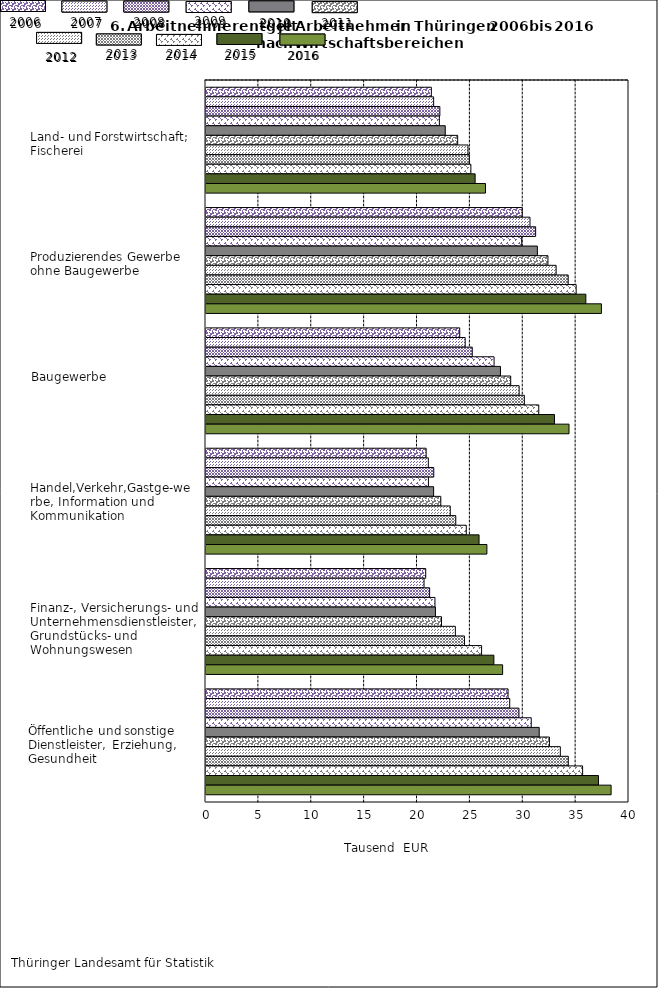
| Category | Series 3 | Series 4 | Series 5 | Series 6 | Series 7 | Series 8 | Series 9 | Series 10 | Series 11 | Series 12 | Series 13 |
|---|---|---|---|---|---|---|---|---|---|---|---|
| Land-und Forstwirtschaft; Fischerei | 21.31 | 21.525 | 22.113 | 22.068 | 22.625 | 23.8 | 24.776 | 24.903 | 25.047 | 25.45 | 26.429 |
| Produzierendes Gewerbe ohne Baugewerbe | 29.9 | 30.638 | 31.173 | 29.856 | 31.336 | 32.335 | 33.109 | 34.25 | 35.004 | 35.92 | 37.391 |
| Baugewerbe | 23.993 | 24.508 | 25.179 | 27.24 | 27.846 | 28.814 | 29.61 | 30.104 | 31.466 | 32.954 | 34.328 |
| Handel, Verkehr, Gastgewerbe, Information und Kommunikation | 20.818 | 21.023 | 21.537 | 21.034 | 21.526 | 22.204 | 23.099 | 23.619 | 24.614 | 25.821 | 26.561 |
| Finanz-, Versicherungs- und Unternehmensdienstl., Grundstücks- und Wohnungswesen | 20.777 | 20.619 | 21.147 | 21.651 | 21.697 | 22.27 | 23.58 | 24.441 | 26.062 | 27.224 | 28.051 |
| Öffentliche und sonstige Dienstleister, Erziehung, Gesundheit | 28.563 | 28.72 | 29.593 | 30.756 | 31.509 | 32.477 | 33.505 | 34.261 | 35.614 | 37.114 | 38.308 |